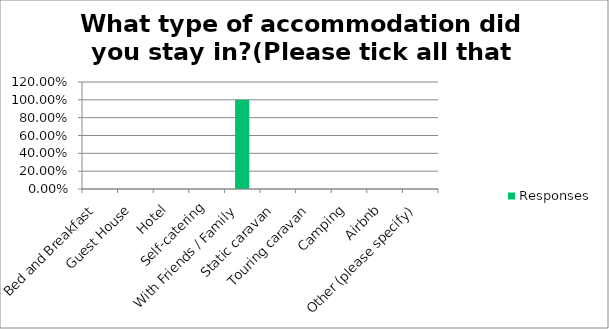
| Category | Responses |
|---|---|
| Bed and Breakfast | 0 |
| Guest House | 0 |
| Hotel | 0 |
| Self-catering | 0 |
| With Friends / Family | 1 |
| Static caravan | 0 |
| Touring caravan | 0 |
| Camping | 0 |
| Airbnb | 0 |
| Other (please specify) | 0 |